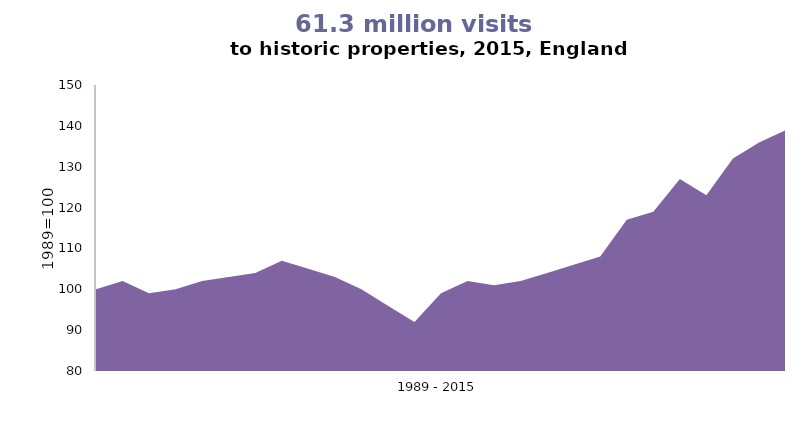
| Category | Series 0 |
|---|---|
| 0 | 100 |
| 1 | 102 |
| 2 | 99 |
| 3 | 100 |
| 4 | 102 |
| 5 | 103 |
| 6 | 104 |
| 7 | 107 |
| 8 | 105 |
| 9 | 103 |
| 10 | 100 |
| 11 | 96 |
| 12 | 92 |
| 13 | 99 |
| 14 | 102 |
| 15 | 101 |
| 16 | 102 |
| 17 | 104 |
| 18 | 106 |
| 19 | 108 |
| 20 | 117 |
| 21 | 119 |
| 22 | 127 |
| 23 | 123 |
| 24 | 132 |
| 25 | 136 |
| 26 | 139 |